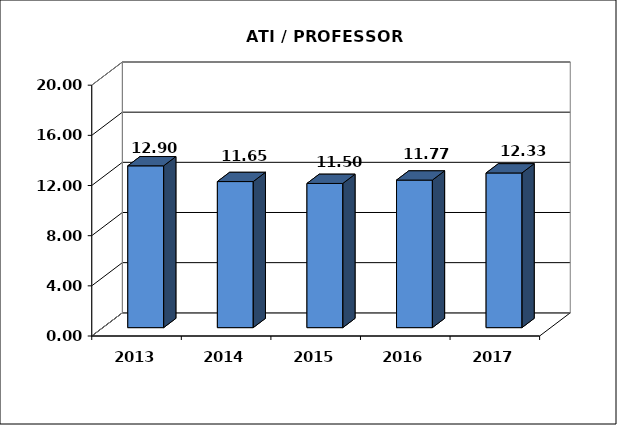
| Category | Series 0 |
|---|---|
| 2013.0 | 12.904 |
| 2014.0 | 11.649 |
| 2015.0 | 11.498 |
| 2016.0 | 11.766 |
| 2017.0 | 12.334 |